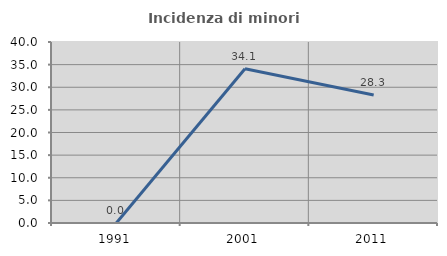
| Category | Incidenza di minori stranieri |
|---|---|
| 1991.0 | 0 |
| 2001.0 | 34.091 |
| 2011.0 | 28.302 |